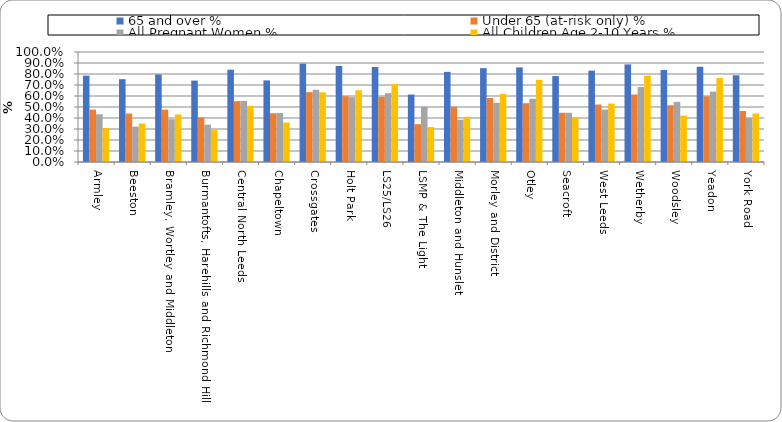
| Category | 65 and over % | Under 65 (at-risk only) % | All Pregnant Women % | All Children Age 2-10 Years % |
|---|---|---|---|---|
| Armley | 0.785 | 0.476 | 0.434 | 0.308 |
| Beeston | 0.753 | 0.441 | 0.322 | 0.35 |
| Bramley, Wortley and Middleton | 0.795 | 0.476 | 0.389 | 0.432 |
| Burmantofts, Harehills and Richmond Hill | 0.74 | 0.405 | 0.339 | 0.291 |
| Central North Leeds | 0.839 | 0.553 | 0.555 | 0.51 |
| Chapeltown | 0.742 | 0.443 | 0.445 | 0.359 |
| Crossgates | 0.894 | 0.635 | 0.657 | 0.634 |
| Holt Park | 0.873 | 0.598 | 0.589 | 0.652 |
| LS25/LS26 | 0.864 | 0.592 | 0.625 | 0.71 |
| LSMP & The Light | 0.613 | 0.344 | 0.504 | 0.318 |
| Middleton and Hunslet | 0.82 | 0.503 | 0.385 | 0.411 |
| Morley and District | 0.853 | 0.582 | 0.538 | 0.62 |
| Otley | 0.86 | 0.535 | 0.574 | 0.747 |
| Seacroft | 0.781 | 0.448 | 0.447 | 0.404 |
| West Leeds | 0.831 | 0.522 | 0.477 | 0.531 |
| Wetherby | 0.887 | 0.614 | 0.681 | 0.785 |
| Woodsley | 0.836 | 0.516 | 0.547 | 0.422 |
| Yeadon | 0.866 | 0.596 | 0.64 | 0.763 |
| York Road | 0.788 | 0.464 | 0.399 | 0.441 |